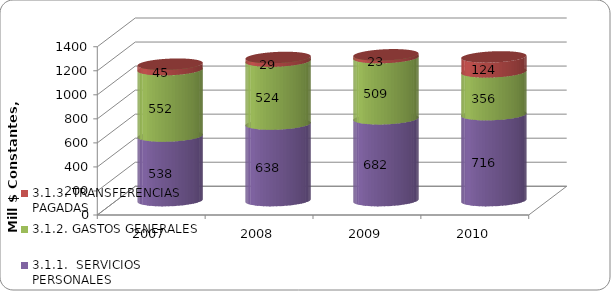
| Category | 3.1.1.  SERVICIOS PERSONALES | 3.1.2. GASTOS GENERALES | 3.1.3. TRANSFERENCIAS PAGADAS |
|---|---|---|---|
| 2007 | 538.198 | 551.794 | 45.322 |
| 2008 | 637.714 | 524.062 | 29.465 |
| 2009 | 681.954 | 508.628 | 22.697 |
| 2010 | 716 | 356 | 124 |